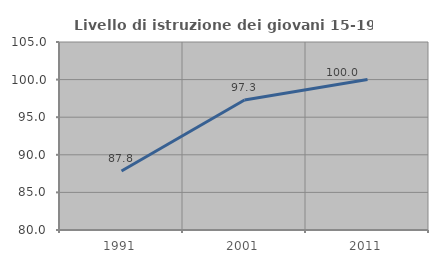
| Category | Livello di istruzione dei giovani 15-19 anni |
|---|---|
| 1991.0 | 87.838 |
| 2001.0 | 97.297 |
| 2011.0 | 100 |